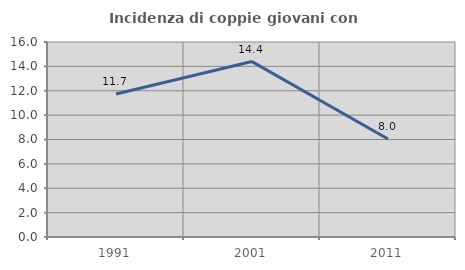
| Category | Incidenza di coppie giovani con figli |
|---|---|
| 1991.0 | 11.728 |
| 2001.0 | 14.394 |
| 2011.0 | 8.036 |